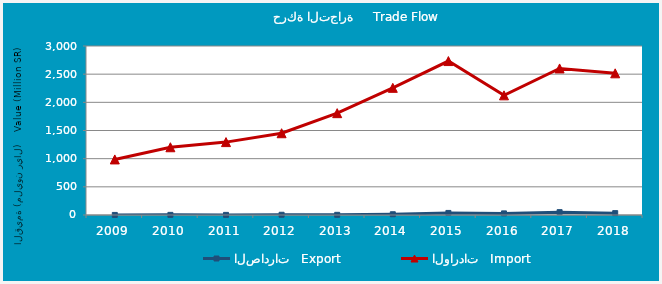
| Category | الصادرات   Export | الواردات   Import |
|---|---|---|
| 2009.0 | 1315257 | 986492463 |
| 2010.0 | 2459319 | 1202656334 |
| 2011.0 | 2113955 | 1293961497 |
| 2012.0 | 4423342 | 1451208981 |
| 2013.0 | 3193641 | 1807615404 |
| 2014.0 | 13449745 | 2257369487 |
| 2015.0 | 36644808 | 2732469288 |
| 2016.0 | 28573209 | 2123836111 |
| 2017.0 | 50631808 | 2601681419 |
| 2018.0 | 33138063 | 2514896460 |